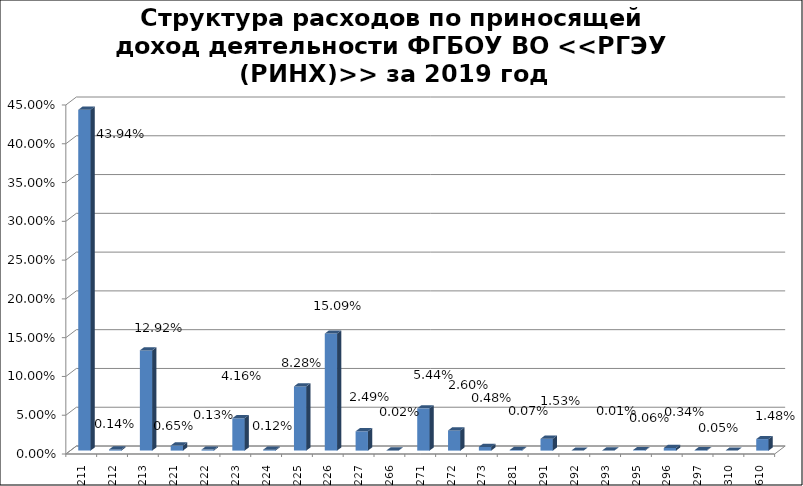
| Category | Series 0 |
|---|---|
|  211 | 0.439 |
|  212 | 0.001 |
|  213 | 0.129 |
|  221 | 0.006 |
|  222 | 0.001 |
|  223 | 0.042 |
|  224 | 0.001 |
|  225 | 0.083 |
|  226 | 0.151 |
| 227 | 0.025 |
| 266 | 0 |
| 271 | 0.054 |
| 272 | 0.026 |
| 273 | 0.005 |
| 281 | 0.001 |
| 291 | 0.015 |
| 292 | 0 |
| 293 | 0 |
| 295 | 0.001 |
| 296 | 0.003 |
| 297 | 0.001 |
| 310 | 0 |
| 610 | 0.015 |